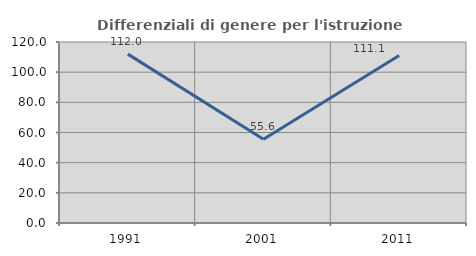
| Category | Differenziali di genere per l'istruzione superiore |
|---|---|
| 1991.0 | 111.957 |
| 2001.0 | 55.556 |
| 2011.0 | 111.111 |